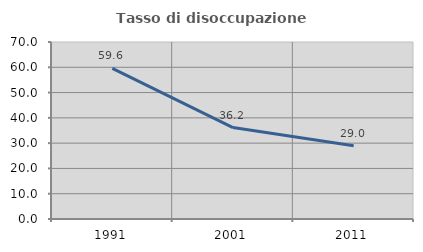
| Category | Tasso di disoccupazione giovanile  |
|---|---|
| 1991.0 | 59.574 |
| 2001.0 | 36.17 |
| 2011.0 | 29 |